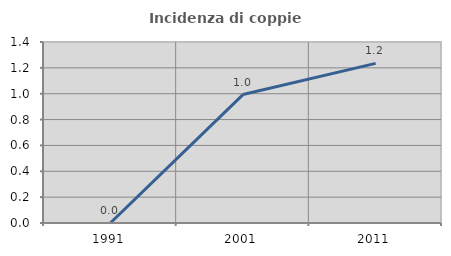
| Category | Incidenza di coppie miste |
|---|---|
| 1991.0 | 0 |
| 2001.0 | 0.993 |
| 2011.0 | 1.235 |